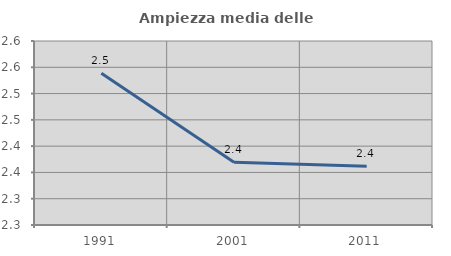
| Category | Ampiezza media delle famiglie |
|---|---|
| 1991.0 | 2.539 |
| 2001.0 | 2.369 |
| 2011.0 | 2.362 |